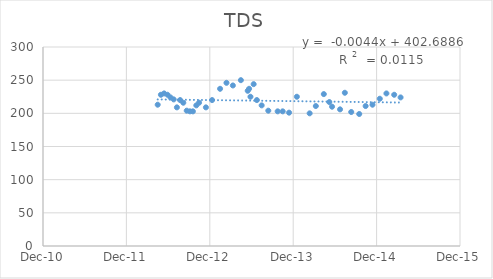
| Category | Series 0 |
|---|---|
| 41017.0 | 213 |
| 41031.0 | 228 |
| 41045.0 | 230 |
| 41060.0 | 228 |
| 41073.0 | 224 |
| 41087.0 | 221 |
| 41101.0 | 209 |
| 41115.0 | 220 |
| 41129.0 | 216 |
| 41144.0 | 204 |
| 41158.0 | 203 |
| 41171.0 | 203 |
| 41186.0 | 212 |
| 41198.0 | 216 |
| 41228.0 | 209 |
| 41255.0 | 220 |
| 41290.0 | 237 |
| 41318.0 | 246 |
| 41346.0 | 242 |
| 41381.0 | 250 |
| 41411.0 | 234 |
| 41417.0 | 237 |
| 41423.0 | 225 |
| 41437.0 | 244 |
| 41451.0 | 220 |
| 41472.0 | 212 |
| 41501.0 | 204 |
| 41542.0 | 203 |
| 41564.0 | 203 |
| 41592.0 | 201 |
| 41626.0 | 225 |
| 41682.0 | 200 |
| 41709.0 | 211 |
| 41744.0 | 229 |
| 41768.0 | 217 |
| 41780.0 | 210 |
| 41815.0 | 206 |
| 41836.0 | 231 |
| 41864.0 | 202 |
| 41899.0 | 199 |
| 41927.0 | 211 |
| 41957.0 | 213 |
| 41989.0 | 222 |
| 42018.0 | 230 |
| 42052.0 | 228 |
| 42080.0 | 224 |